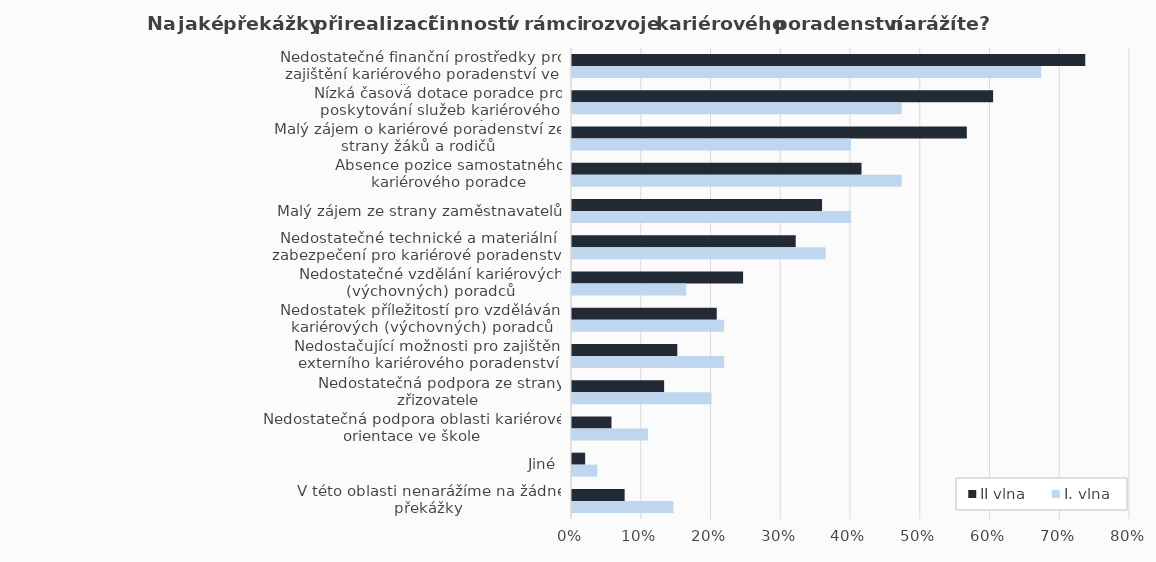
| Category | II vlna | I. vlna |
|---|---|---|
| Nedostatečné finanční prostředky pro zajištění kariérového poradenství ve škole | 0.736 | 0.673 |
| Nízká časová dotace poradce pro poskytování služeb kariérového poradenství | 0.604 | 0.473 |
| Malý zájem o kariérové poradenství ze strany žáků a rodičů | 0.566 | 0.4 |
| Absence pozice samostatného kariérového poradce | 0.415 | 0.473 |
| Malý zájem ze strany zaměstnavatelů | 0.358 | 0.4 |
| Nedostatečné technické a materiální zabezpečení pro kariérové poradenství | 0.321 | 0.364 |
| Nedostatečné vzdělání kariérových (výchovných) poradců | 0.245 | 0.164 |
| Nedostatek příležitostí pro vzdělávání kariérových (výchovných) poradců | 0.208 | 0.218 |
| Nedostačující možnosti pro zajištění externího kariérového poradenství | 0.151 | 0.218 |
| Nedostatečná podpora ze strany zřizovatele | 0.132 | 0.2 |
| Nedostatečná podpora oblasti kariérové orientace ve škole | 0.057 | 0.109 |
| Jiné | 0.019 | 0.036 |
| V této oblasti nenarážíme na žádné překážky | 0.075 | 0.145 |